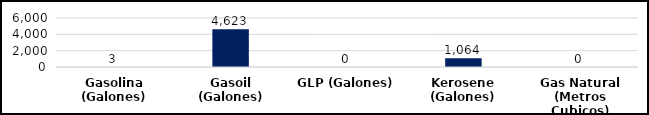
| Category | Series 0 |
|---|---|
| Gasolina (Galones) | 3 |
| Gasoil (Galones) | 4623 |
| GLP (Galones) | 0 |
| Kerosene (Galones) | 1064 |
| Gas Natural (Metros Cubicos) | 0 |